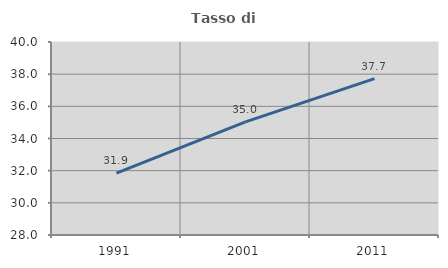
| Category | Tasso di occupazione   |
|---|---|
| 1991.0 | 31.853 |
| 2001.0 | 35.033 |
| 2011.0 | 37.72 |